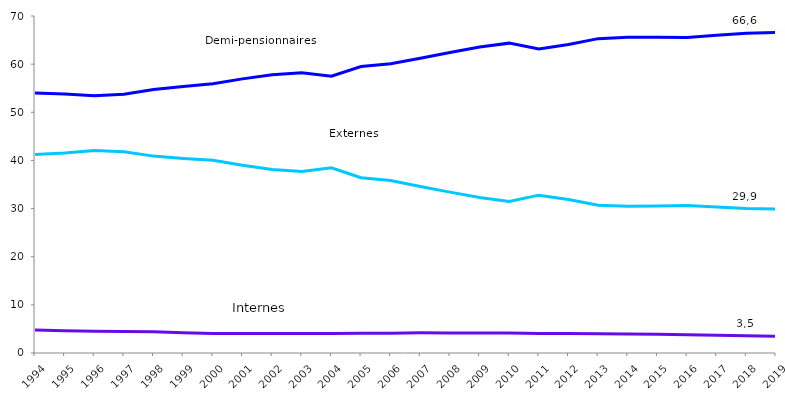
| Category | Demi-pensionnaires | Externes | Internes |
|---|---|---|---|
| 1994.0 | 53.992 | 41.231 | 4.777 |
| 1995.0 | 53.819 | 41.554 | 4.627 |
| 1996.0 | 53.416 | 42.077 | 4.507 |
| 1997.0 | 53.752 | 41.793 | 4.455 |
| 1998.0 | 54.714 | 40.896 | 4.39 |
| 1999.0 | 55.364 | 40.421 | 4.215 |
| 2000.0 | 55.923 | 40.038 | 4.039 |
| 2001.0 | 56.94 | 39.013 | 4.047 |
| 2002.0 | 57.793 | 38.139 | 4.068 |
| 2003.0 | 58.236 | 37.723 | 4.041 |
| 2004.0 | 57.495 | 38.472 | 4.034 |
| 2005.0 | 59.494 | 36.415 | 4.091 |
| 2006.0 | 60.065 | 35.816 | 4.119 |
| 2007.0 | 61.214 | 34.577 | 4.209 |
| 2008.0 | 62.406 | 33.42 | 4.173 |
| 2009.0 | 63.579 | 32.28 | 4.141 |
| 2010.0 | 64.362 | 31.493 | 4.145 |
| 2011.0 | 63.143 | 32.788 | 4.069 |
| 2012.0 | 64.076 | 31.896 | 4.028 |
| 2013.0 | 65.295 | 30.69 | 4.014 |
| 2014.0 | 65.571 | 30.478 | 3.951 |
| 2015.0 | 65.574 | 30.524 | 3.902 |
| 2016.0 | 65.538 | 30.657 | 3.805 |
| 2017.0 | 66.015 | 30.306 | 3.679 |
| 2018.0 | 66.4 | 30 | 3.6 |
| 2019.0 | 66.6 | 29.9 | 3.5 |